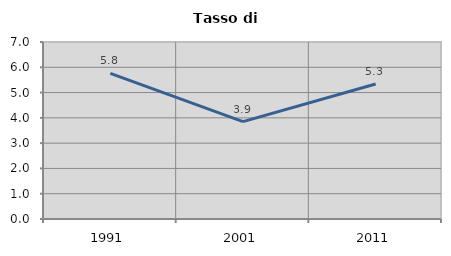
| Category | Tasso di disoccupazione   |
|---|---|
| 1991.0 | 5.762 |
| 2001.0 | 3.853 |
| 2011.0 | 5.341 |